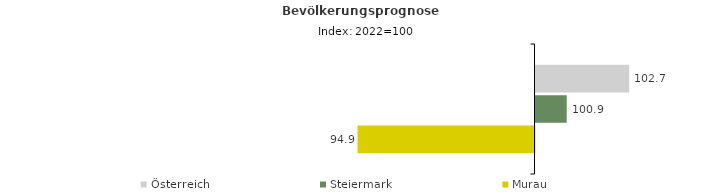
| Category | Österreich | Steiermark | Murau |
|---|---|---|---|
| 2022.0 | 102.7 | 100.9 | 94.9 |